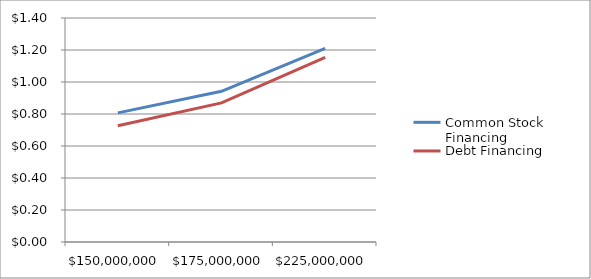
| Category | Common Stock Financing | Debt Financing |
|---|---|---|
| 150000000.0 | 0.807 | 0.727 |
| 175000000.0 | 0.942 | 0.869 |
| 225000000.0 | 1.211 | 1.154 |